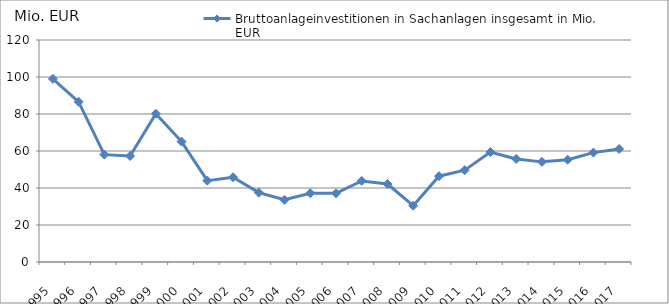
| Category | Bruttoanlageinvestitionen in Sachanlagen insgesamt in Mio. EUR |
|---|---|
| 1995.0 | 99 |
| 1996.0 | 86.587 |
| 1997.0 | 58.03 |
| 1998.0 | 57.307 |
| 1999.0 | 80.155 |
| 2000.0 | 65.078 |
| 2001.0 | 43.973 |
| 2002.0 | 45.812 |
| 2003.0 | 37.496 |
| 2004.0 | 33.615 |
| 2005.0 | 37.159 |
| 2006.0 | 37.16 |
| 2007.0 | 43.825 |
| 2008.0 | 42.134 |
| 2009.0 | 30.418 |
| 2010.0 | 46.387 |
| 2011.0 | 49.643 |
| 2012.0 | 59.396 |
| 2013.0 | 55.726 |
| 2014.0 | 54.126 |
| 2015.0 | 55.311 |
| 2016.0 | 59.135 |
| 2017.0 | 61.128 |